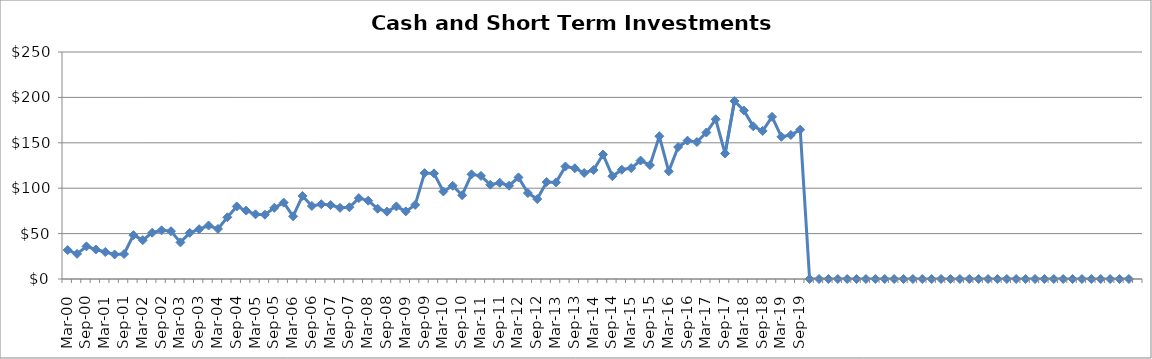
| Category | Cash and Short-Term Investments ($Millions) |
|---|---|
| Mar-00 | 31.904 |
| Jun-00 | 27.691 |
| Sep-00 | 35.922 |
| Dec-00 | 32.484 |
| Mar-01 | 29.735 |
| Jun-01 | 27 |
| Sep-01 | 27.5 |
| Dec-01 | 48.284 |
| Mar-02 | 42.779 |
| Jun-02 | 51 |
| Sep-02 | 53.614 |
| Dec-02 | 52.609 |
| Mar-03 | 40.326 |
| Jun-03 | 50.8 |
| Sep-03 | 54.865 |
| Dec-03 | 58.929 |
| Mar-04 | 55.14 |
| Jun-04 | 67.965 |
| Sep-04 | 79.869 |
| Dec-04 | 75.348 |
| Mar-05 | 71.257 |
| Jun-05 | 70.795 |
| Sep-05 | 78.388 |
| Dec-05 | 84.145 |
| Mar-06 | 69.039 |
| Jun-06 | 91.512 |
| Sep-06 | 80.416 |
| Dec-06 | 82.37 |
| Mar-07 | 81.474 |
| Jun-07 | 78.4 |
| Sep-07 | 79.034 |
| Dec-07 | 89.086 |
| Mar-08 | 86.262 |
| Jun-08 | 77.356 |
| Sep-08 | 74.212 |
| Dec-08 | 79.959 |
| Mar-09 | 74.476 |
| Jun-09 | 81.606 |
| Sep-09 | 116.634 |
| Dec-09 | 116.335 |
| Mar-10 | 96.432 |
| Jun-10 | 102.698 |
| Sep-10 | 92.254 |
| Dec-10 | 115.286 |
| Mar-11 | 113.595 |
| Jun-11 | 103.823 |
| Sep-11 | 105.998 |
| Dec-11 | 102.741 |
| Mar-12 | 111.914 |
| Jun-12 | 94.671 |
| Sep-12 | 88.049 |
| Dec-12 | 106.836 |
| Mar-13 | 106.415 |
| Jun-13 | 123.928 |
| Sep-13 | 121.99 |
| Dec-13 | 116.739 |
| Mar-14 | 120 |
| Jun-14 | 137.166 |
| Sep-14 | 113.244 |
| Dec-14 | 120.315 |
| Mar-15 | 122.156 |
| Jun-15 | 130.439 |
| Sep-15 | 125.421 |
| Dec-15 | 157.215 |
| Mar-16 | 118.595 |
| Jun-16 | 145.352 |
| Sep-16 | 152.34 |
| Dec-16 | 150.857 |
| Mar-17 | 161.321 |
| Jun-17 | 175.915 |
| Sep-17 | 138.22 |
| Dec-17 | 196 |
| Mar-18 | 185.6 |
| Jun-18 | 168.2 |
| Sep-18 | 163.1 |
| Dec-18 | 178.614 |
| Mar-19 | 156.606 |
| Jun-19 | 158.636 |
| Sep-19 | 164.535 |